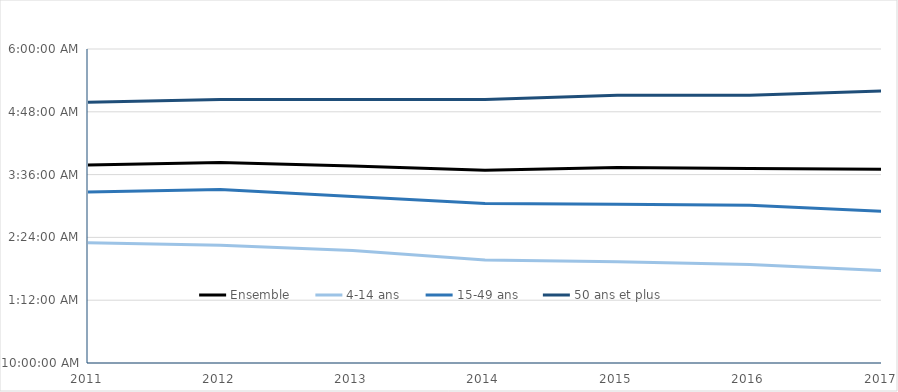
| Category | Ensemble | 4-14 ans | 15-49 ans | 50 ans et plus |
|---|---|---|---|---|
| 2011.0 | 0.158 | 0.096 | 0.136 | 0.208 |
| 2012.0 | 0.16 | 0.094 | 0.138 | 0.21 |
| 2013.0 | 0.157 | 0.09 | 0.133 | 0.21 |
| 2014.0 | 0.153 | 0.082 | 0.127 | 0.21 |
| 2015.0 | 0.156 | 0.081 | 0.126 | 0.213 |
| 2016.0 | 0.155 | 0.078 | 0.126 | 0.213 |
| 2017.0 | 0.154 | 0.074 | 0.121 | 0.217 |